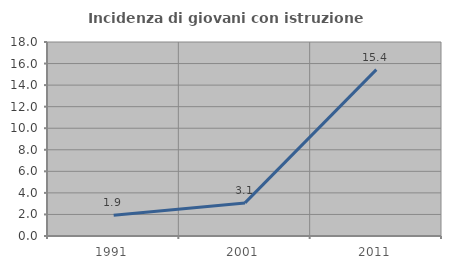
| Category | Incidenza di giovani con istruzione universitaria |
|---|---|
| 1991.0 | 1.923 |
| 2001.0 | 3.07 |
| 2011.0 | 15.441 |